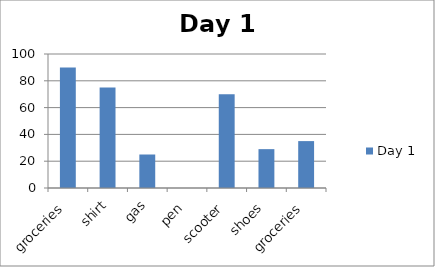
| Category | Day 1 |
|---|---|
| groceries | 90 |
| shirt | 75 |
| gas | 25 |
| pen | 0 |
| scooter | 70 |
| shoes | 29 |
| groceries | 35 |